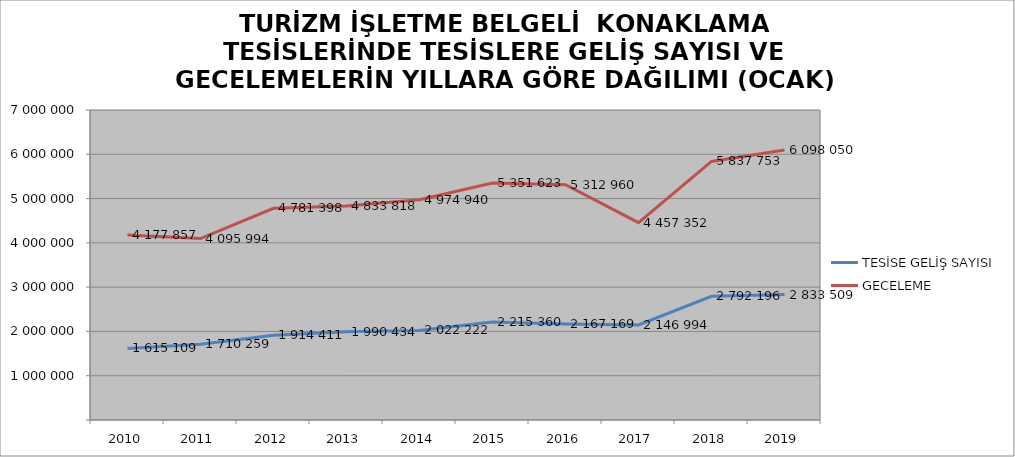
| Category | TESİSE GELİŞ SAYISI | GECELEME |
|---|---|---|
| 2010 | 1615109 | 4177857 |
| 2011 | 1710259 | 4095994 |
| 2012 | 1914411 | 4781398 |
| 2013 | 1990434 | 4833818 |
| 2014 | 2022222 | 4974940 |
| 2015 | 2215360 | 5351623 |
| 2016 | 2167169 | 5312960 |
| 2017 | 2146994 | 4457352 |
| 2018 | 2792196 | 5837753 |
| 2019 | 2833509 | 6098050 |